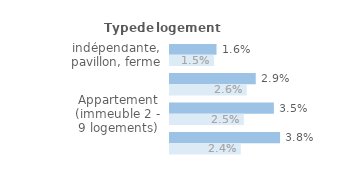
| Category | Series 1 | Series 0 |
|---|---|---|
| Maison indépendante, pavillon, ferme | 0.016 | 0.015 |
| Maison de ville groupée | 0.029 | 0.026 |
| Appartement (immeuble 2 - 9 logements) | 0.035 | 0.025 |
| Appartement (immeuble de 10 logements ou +) | 0.038 | 0.024 |